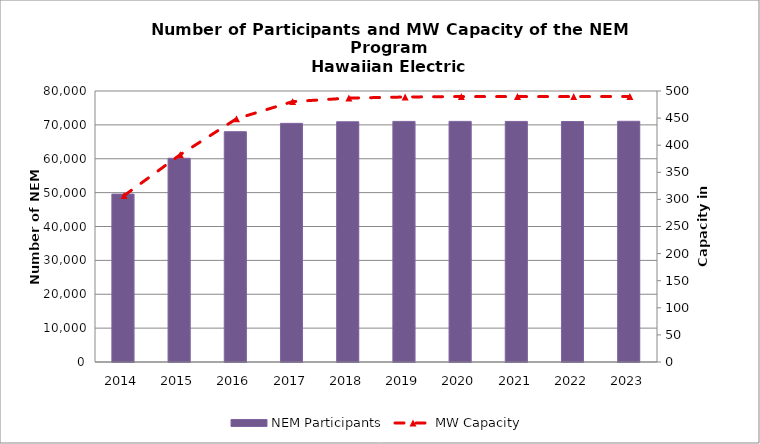
| Category | NEM Participants |
|---|---|
| 2014.0 | 49570 |
| 2015.0 | 60142 |
| 2016.0 | 67994 |
| 2017.0 | 70445 |
| 2018.0 | 70921 |
| 2019.0 | 71023 |
| 2020.0 | 71029 |
| 2021.0 | 71018 |
| 2022.0 | 70999 |
| 2023.0 | 71058 |